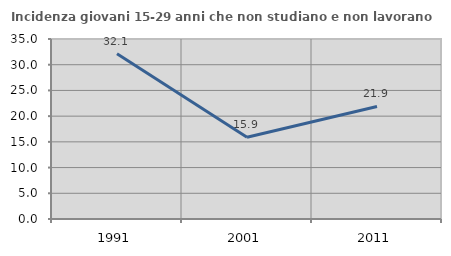
| Category | Incidenza giovani 15-29 anni che non studiano e non lavorano  |
|---|---|
| 1991.0 | 32.143 |
| 2001.0 | 15.885 |
| 2011.0 | 21.882 |